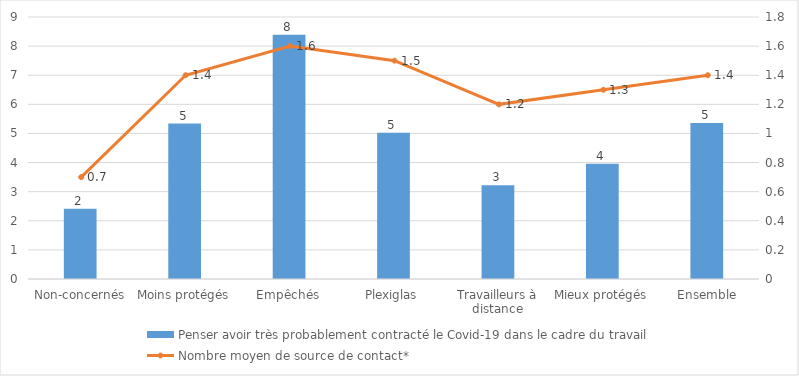
| Category | Penser avoir très probablement contracté le Covid-19 dans le cadre du travail |
|---|---|
| Non-concernés | 2.41 |
| Moins protégés | 5.34 |
| Empêchés | 8.39 |
| Plexiglas | 5.02 |
| Travailleurs à distance | 3.22 |
| Mieux protégés | 3.96 |
|  Ensemble | 5.36 |